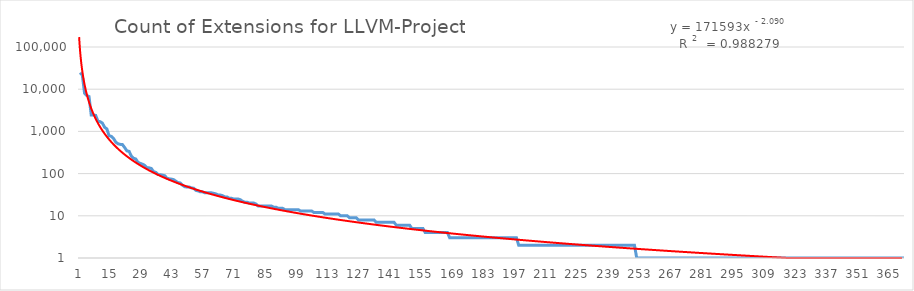
| Category | Count of Extensions for LLVM-Project |
|---|---|
| 0 | 24661 |
| 1 | 21411 |
| 2 | 8043 |
| 3 | 7081 |
| 4 | 6680 |
| 5 | 2444 |
| 6 | 2442 |
| 7 | 2387 |
| 8 | 1745 |
| 9 | 1700 |
| 10 | 1577 |
| 11 | 1252 |
| 12 | 1148 |
| 13 | 790 |
| 14 | 763 |
| 15 | 683 |
| 16 | 557 |
| 17 | 510 |
| 18 | 493 |
| 19 | 488 |
| 20 | 415 |
| 21 | 346 |
| 22 | 336 |
| 23 | 261 |
| 24 | 231 |
| 25 | 222 |
| 26 | 184 |
| 27 | 175 |
| 28 | 167 |
| 29 | 157 |
| 30 | 138 |
| 31 | 137 |
| 32 | 132 |
| 33 | 111 |
| 34 | 107 |
| 35 | 95 |
| 36 | 94 |
| 37 | 92 |
| 38 | 89 |
| 39 | 78 |
| 40 | 75 |
| 41 | 74 |
| 42 | 72 |
| 43 | 66 |
| 44 | 61 |
| 45 | 60 |
| 46 | 53 |
| 47 | 49 |
| 48 | 48 |
| 49 | 48 |
| 50 | 46 |
| 51 | 45 |
| 52 | 40 |
| 53 | 39 |
| 54 | 37 |
| 55 | 37 |
| 56 | 35 |
| 57 | 35 |
| 58 | 35 |
| 59 | 35 |
| 60 | 34 |
| 61 | 33 |
| 62 | 31 |
| 63 | 31 |
| 64 | 30 |
| 65 | 28 |
| 66 | 28 |
| 67 | 26 |
| 68 | 26 |
| 69 | 25 |
| 70 | 25 |
| 71 | 25 |
| 72 | 24 |
| 73 | 22 |
| 74 | 21 |
| 75 | 21 |
| 76 | 20 |
| 77 | 20 |
| 78 | 20 |
| 79 | 19 |
| 80 | 17 |
| 81 | 17 |
| 82 | 17 |
| 83 | 17 |
| 84 | 17 |
| 85 | 17 |
| 86 | 17 |
| 87 | 16 |
| 88 | 16 |
| 89 | 15 |
| 90 | 15 |
| 91 | 15 |
| 92 | 14 |
| 93 | 14 |
| 94 | 14 |
| 95 | 14 |
| 96 | 14 |
| 97 | 14 |
| 98 | 14 |
| 99 | 13 |
| 100 | 13 |
| 101 | 13 |
| 102 | 13 |
| 103 | 13 |
| 104 | 13 |
| 105 | 12 |
| 106 | 12 |
| 107 | 12 |
| 108 | 12 |
| 109 | 12 |
| 110 | 11 |
| 111 | 11 |
| 112 | 11 |
| 113 | 11 |
| 114 | 11 |
| 115 | 11 |
| 116 | 11 |
| 117 | 10 |
| 118 | 10 |
| 119 | 10 |
| 120 | 10 |
| 121 | 9 |
| 122 | 9 |
| 123 | 9 |
| 124 | 9 |
| 125 | 8 |
| 126 | 8 |
| 127 | 8 |
| 128 | 8 |
| 129 | 8 |
| 130 | 8 |
| 131 | 8 |
| 132 | 8 |
| 133 | 7 |
| 134 | 7 |
| 135 | 7 |
| 136 | 7 |
| 137 | 7 |
| 138 | 7 |
| 139 | 7 |
| 140 | 7 |
| 141 | 7 |
| 142 | 6 |
| 143 | 6 |
| 144 | 6 |
| 145 | 6 |
| 146 | 6 |
| 147 | 6 |
| 148 | 6 |
| 149 | 5 |
| 150 | 5 |
| 151 | 5 |
| 152 | 5 |
| 153 | 5 |
| 154 | 5 |
| 155 | 4 |
| 156 | 4 |
| 157 | 4 |
| 158 | 4 |
| 159 | 4 |
| 160 | 4 |
| 161 | 4 |
| 162 | 4 |
| 163 | 4 |
| 164 | 4 |
| 165 | 4 |
| 166 | 3 |
| 167 | 3 |
| 168 | 3 |
| 169 | 3 |
| 170 | 3 |
| 171 | 3 |
| 172 | 3 |
| 173 | 3 |
| 174 | 3 |
| 175 | 3 |
| 176 | 3 |
| 177 | 3 |
| 178 | 3 |
| 179 | 3 |
| 180 | 3 |
| 181 | 3 |
| 182 | 3 |
| 183 | 3 |
| 184 | 3 |
| 185 | 3 |
| 186 | 3 |
| 187 | 3 |
| 188 | 3 |
| 189 | 3 |
| 190 | 3 |
| 191 | 3 |
| 192 | 3 |
| 193 | 3 |
| 194 | 3 |
| 195 | 3 |
| 196 | 3 |
| 197 | 2 |
| 198 | 2 |
| 199 | 2 |
| 200 | 2 |
| 201 | 2 |
| 202 | 2 |
| 203 | 2 |
| 204 | 2 |
| 205 | 2 |
| 206 | 2 |
| 207 | 2 |
| 208 | 2 |
| 209 | 2 |
| 210 | 2 |
| 211 | 2 |
| 212 | 2 |
| 213 | 2 |
| 214 | 2 |
| 215 | 2 |
| 216 | 2 |
| 217 | 2 |
| 218 | 2 |
| 219 | 2 |
| 220 | 2 |
| 221 | 2 |
| 222 | 2 |
| 223 | 2 |
| 224 | 2 |
| 225 | 2 |
| 226 | 2 |
| 227 | 2 |
| 228 | 2 |
| 229 | 2 |
| 230 | 2 |
| 231 | 2 |
| 232 | 2 |
| 233 | 2 |
| 234 | 2 |
| 235 | 2 |
| 236 | 2 |
| 237 | 2 |
| 238 | 2 |
| 239 | 2 |
| 240 | 2 |
| 241 | 2 |
| 242 | 2 |
| 243 | 2 |
| 244 | 2 |
| 245 | 2 |
| 246 | 2 |
| 247 | 2 |
| 248 | 2 |
| 249 | 2 |
| 250 | 1 |
| 251 | 1 |
| 252 | 1 |
| 253 | 1 |
| 254 | 1 |
| 255 | 1 |
| 256 | 1 |
| 257 | 1 |
| 258 | 1 |
| 259 | 1 |
| 260 | 1 |
| 261 | 1 |
| 262 | 1 |
| 263 | 1 |
| 264 | 1 |
| 265 | 1 |
| 266 | 1 |
| 267 | 1 |
| 268 | 1 |
| 269 | 1 |
| 270 | 1 |
| 271 | 1 |
| 272 | 1 |
| 273 | 1 |
| 274 | 1 |
| 275 | 1 |
| 276 | 1 |
| 277 | 1 |
| 278 | 1 |
| 279 | 1 |
| 280 | 1 |
| 281 | 1 |
| 282 | 1 |
| 283 | 1 |
| 284 | 1 |
| 285 | 1 |
| 286 | 1 |
| 287 | 1 |
| 288 | 1 |
| 289 | 1 |
| 290 | 1 |
| 291 | 1 |
| 292 | 1 |
| 293 | 1 |
| 294 | 1 |
| 295 | 1 |
| 296 | 1 |
| 297 | 1 |
| 298 | 1 |
| 299 | 1 |
| 300 | 1 |
| 301 | 1 |
| 302 | 1 |
| 303 | 1 |
| 304 | 1 |
| 305 | 1 |
| 306 | 1 |
| 307 | 1 |
| 308 | 1 |
| 309 | 1 |
| 310 | 1 |
| 311 | 1 |
| 312 | 1 |
| 313 | 1 |
| 314 | 1 |
| 315 | 1 |
| 316 | 1 |
| 317 | 1 |
| 318 | 1 |
| 319 | 1 |
| 320 | 1 |
| 321 | 1 |
| 322 | 1 |
| 323 | 1 |
| 324 | 1 |
| 325 | 1 |
| 326 | 1 |
| 327 | 1 |
| 328 | 1 |
| 329 | 1 |
| 330 | 1 |
| 331 | 1 |
| 332 | 1 |
| 333 | 1 |
| 334 | 1 |
| 335 | 1 |
| 336 | 1 |
| 337 | 1 |
| 338 | 1 |
| 339 | 1 |
| 340 | 1 |
| 341 | 1 |
| 342 | 1 |
| 343 | 1 |
| 344 | 1 |
| 345 | 1 |
| 346 | 1 |
| 347 | 1 |
| 348 | 1 |
| 349 | 1 |
| 350 | 1 |
| 351 | 1 |
| 352 | 1 |
| 353 | 1 |
| 354 | 1 |
| 355 | 1 |
| 356 | 1 |
| 357 | 1 |
| 358 | 1 |
| 359 | 1 |
| 360 | 1 |
| 361 | 1 |
| 362 | 1 |
| 363 | 1 |
| 364 | 1 |
| 365 | 1 |
| 366 | 1 |
| 367 | 1 |
| 368 | 1 |
| 369 | 1 |
| 370 | 1 |